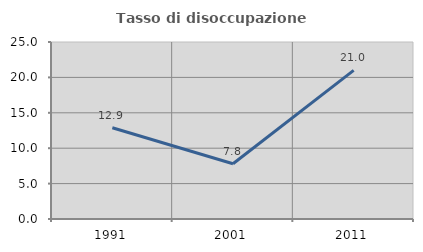
| Category | Tasso di disoccupazione giovanile  |
|---|---|
| 1991.0 | 12.893 |
| 2001.0 | 7.801 |
| 2011.0 | 20.991 |